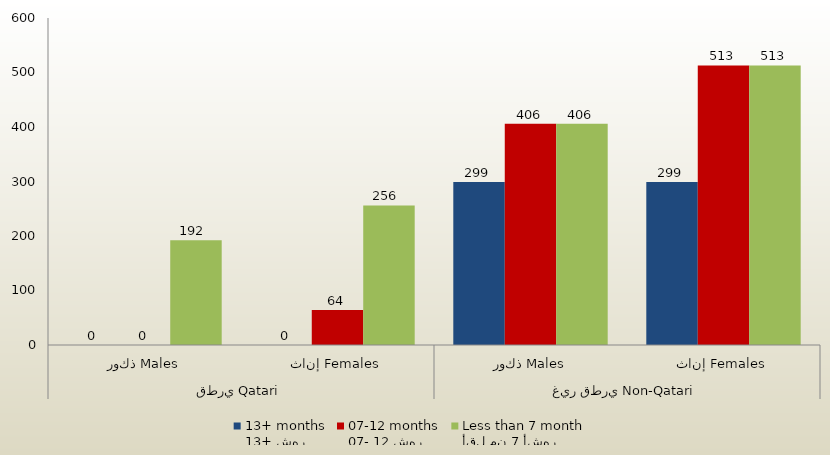
| Category | 13+ شهر
13+ months | 07- 12 شهر
07-12 months | أقل من 7 أشهر
Less than 7 month  |
|---|---|---|---|
| 0 | 0 | 0 | 192 |
| 1 | 0 | 64 | 256 |
| 2 | 299 | 406 | 406 |
| 3 | 299 | 513 | 513 |